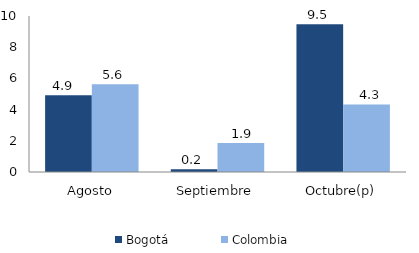
| Category | Bogotá | Colombia |
|---|---|---|
| Agosto | 4.926 | 5.628 |
| Septiembre | 0.18 | 1.862 |
| Octubre(p) | 9.469 | 4.33 |